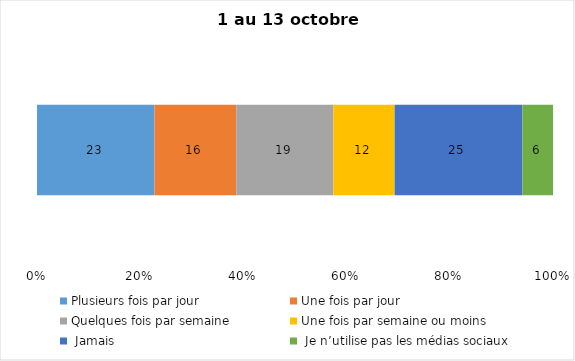
| Category | Plusieurs fois par jour | Une fois par jour | Quelques fois par semaine   | Une fois par semaine ou moins   |  Jamais   |  Je n’utilise pas les médias sociaux |
|---|---|---|---|---|---|---|
| 0 | 23 | 16 | 19 | 12 | 25 | 6 |